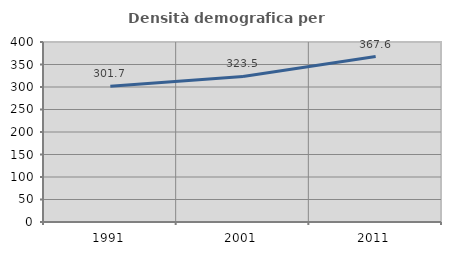
| Category | Densità demografica |
|---|---|
| 1991.0 | 301.712 |
| 2001.0 | 323.457 |
| 2011.0 | 367.609 |